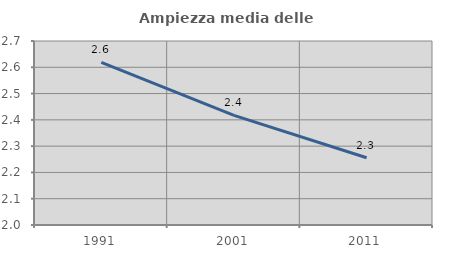
| Category | Ampiezza media delle famiglie |
|---|---|
| 1991.0 | 2.619 |
| 2001.0 | 2.417 |
| 2011.0 | 2.256 |